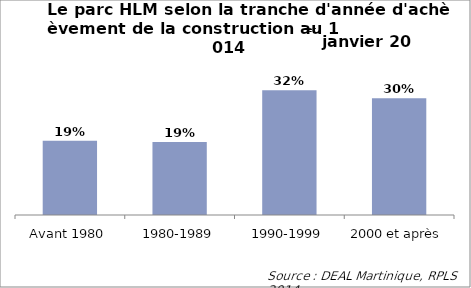
| Category | Series 0 |
|---|---|
| Avant 1980 | 0.191 |
| 1980-1989 | 0.188 |
| 1990-1999 | 0.321 |
| 2000 et après | 0.3 |